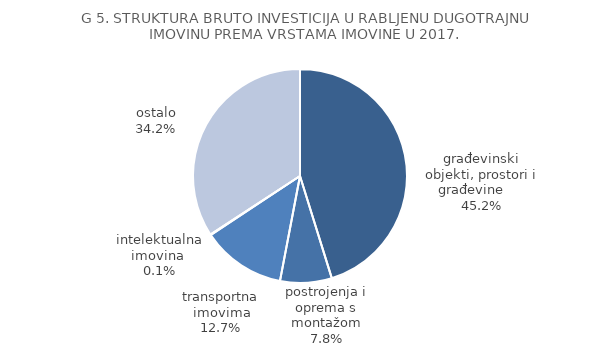
| Category | Series 0 |
|---|---|
| građevinski objekti, prostori i građevine      | 45.2 |
| postrojenja i oprema s montažom | 7.8 |
| transportna imovima | 12.7 |
| intelektualna imovina  | 0.1 |
| ostalo | 34.2 |